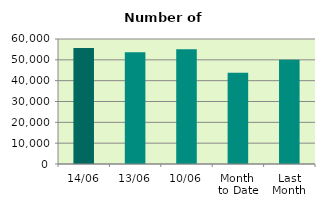
| Category | Series 0 |
|---|---|
| 14/06 | 55622 |
| 13/06 | 53588 |
| 10/06 | 55074 |
| Month 
to Date | 43847 |
| Last
Month | 50099.545 |